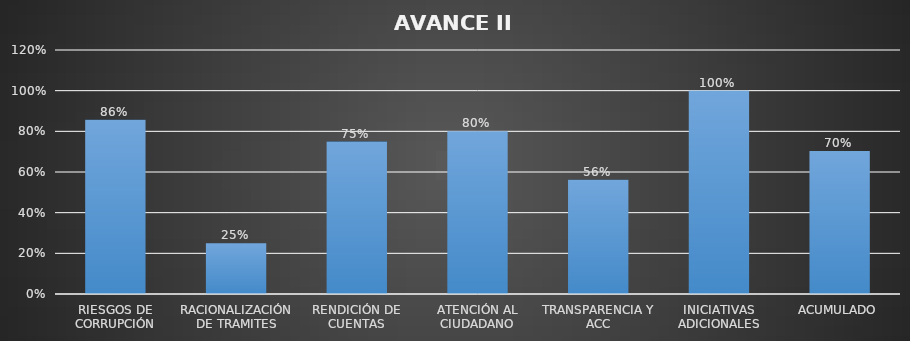
| Category | Series 0 |
|---|---|
| RIESGOS DE CORRUPCIÓN | 0.857 |
| RACIONALIZACIÓN DE TRAMITES | 0.25 |
| RENDICIÓN DE CUENTAS | 0.75 |
| ATENCIÓN AL CIUDADANO | 0.8 |
| TRANSPARENCIA Y ACC | 0.562 |
| INICIATIVAS ADICIONALES | 1 |
| ACUMULADO | 0.703 |